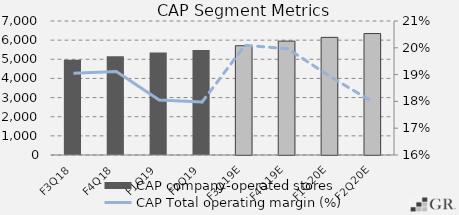
| Category | CAP company-operated stores |
|---|---|
|  F3Q18  | 4979 |
|  F4Q18  | 5159 |
|  F1Q19  | 5350 |
|  F2Q19  | 5483 |
|  F3Q19E  | 5708 |
|  F4Q19E  | 5948 |
|  F1Q20E  | 6145.25 |
|  F2Q20E  | 6344.062 |